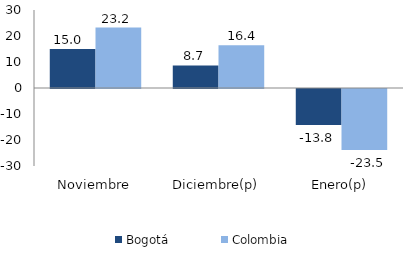
| Category | Bogotá | Colombia |
|---|---|---|
| Noviembre | 14.999 | 23.228 |
| Diciembre(p) | 8.681 | 16.416 |
| Enero(p) | -13.848 | -23.505 |